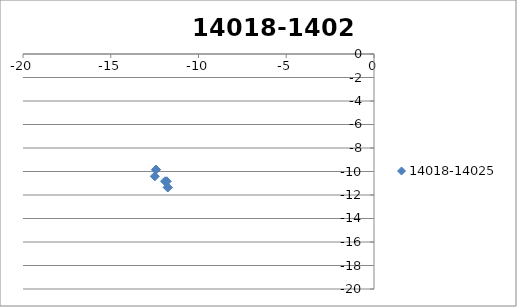
| Category | 14018-14025 |
|---|---|
| -12.423060733613951 | -9.843 |
| -12.423060733613951 | -9.843 |
| -12.487672880336742 | -10.412 |
| -11.748707155742633 | -11.356 |
| -11.908448586891163 | -10.832 |
| -11.753577871316898 | -11.356 |
| -11.803577871316898 | -10.832 |